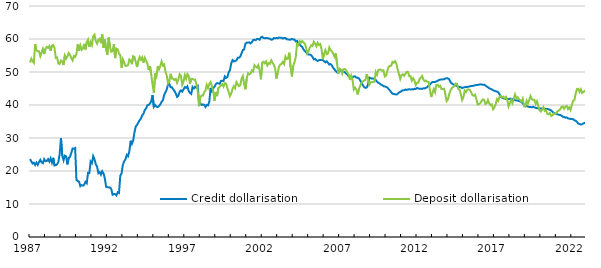
| Category | Credit dollarisation | Deposit dollarisation |
|---|---|---|
| 1987.0 | 23.625 | 52.875 |
| nan | 22.95 | 54.027 |
| nan | 22.258 | 53.298 |
| nan | 22.502 | 52.778 |
| nan | 21.814 | 58.458 |
| nan | 22.546 | 56.475 |
| nan | 21.866 | 56.292 |
| nan | 22.731 | 56.274 |
| nan | 23.362 | 54.792 |
| nan | 22.601 | 55.969 |
| nan | 22.363 | 57.052 |
| nan | 23.592 | 55.442 |
| 1988.0 | 22.977 | 57.05 |
| nan | 23.01 | 57.602 |
| nan | 23.614 | 57.327 |
| nan | 22.852 | 57.869 |
| nan | 23.86 | 56.405 |
| nan | 22.544 | 57.995 |
| nan | 23.986 | 58.181 |
| nan | 21.671 | 57.333 |
| nan | 21.772 | 54.285 |
| nan | 22.031 | 54.407 |
| nan | 22.745 | 52.546 |
| nan | 25.142 | 52.458 |
| 1989.0 | 29.909 | 53.508 |
| nan | 24.636 | 53.181 |
| nan | 23.25 | 52.127 |
| nan | 24.665 | 54.97 |
| nan | 24.465 | 54.05 |
| nan | 21.995 | 54.698 |
| nan | 24.015 | 55.753 |
| nan | 24.262 | 55.217 |
| nan | 25.462 | 54.244 |
| nan | 26.803 | 53.485 |
| nan | 26.749 | 54.857 |
| nan | 26.966 | 54.559 |
| 1990.0 | 17.318 | 55.462 |
| nan | 16.93 | 58.372 |
| nan | 16.795 | 56.471 |
| nan | 15.404 | 58.031 |
| nan | 15.742 | 56.711 |
| nan | 15.569 | 57.125 |
| nan | 15.812 | 58.503 |
| nan | 16.734 | 56.823 |
| nan | 16.287 | 58.989 |
| nan | 19.439 | 59.795 |
| nan | 19.378 | 57.582 |
| nan | 22.874 | 59.032 |
| 1991.0 | 22.371 | 58.133 |
| nan | 24.51 | 60.785 |
| nan | 23.556 | 61.282 |
| nan | 22.036 | 59.332 |
| nan | 21.344 | 58.586 |
| nan | 19.34 | 59.74 |
| nan | 19.683 | 60.063 |
| nan | 18.882 | 58.736 |
| nan | 19.931 | 61.424 |
| nan | 19.258 | 57.326 |
| nan | 17.786 | 59.85 |
| nan | 15.223 | 56.737 |
| 1992.0 | 15.105 | 55.246 |
| nan | 15.025 | 60.45 |
| nan | 14.99 | 57.648 |
| nan | 14.555 | 56.132 |
| nan | 12.8 | 56.356 |
| nan | 13.004 | 58.431 |
| nan | 13.004 | 54.208 |
| nan | 12.606 | 57.092 |
| nan | 13.556 | 56.875 |
| nan | 13.359 | 55.592 |
| nan | 18.561 | 55.136 |
| nan | 19.284 | 51.229 |
| 1993.0 | 21.895 | 53.812 |
| nan | 22.955 | 52.893 |
| nan | 23.499 | 51.839 |
| nan | 24.885 | 51.865 |
| nan | 24.446 | 52.084 |
| nan | 25.969 | 53.816 |
| nan | 29.162 | 53.497 |
| nan | 28.207 | 52.378 |
| nan | 29.243 | 54.8 |
| nan | 31.764 | 54.559 |
| nan | 33.498 | 52.968 |
| nan | 33.983 | 51.516 |
| 1994.0 | 34.715 | 53.424 |
| nan | 35.414 | 54.562 |
| nan | 35.877 | 53.697 |
| nan | 36.906 | 54.414 |
| nan | 37.356 | 52.816 |
| nan | 38.5 | 54.295 |
| nan | 38.976 | 53.401 |
| nan | 39.917 | 52.561 |
| nan | 40.022 | 50.595 |
| nan | 40.473 | 51.76 |
| nan | 41.216 | 49.124 |
| nan | 42.967 | 46.2 |
| 1995.0 | 39.44 | 43.739 |
| nan | 39.979 | 49.526 |
| nan | 39.488 | 48.642 |
| nan | 39.395 | 51.711 |
| nan | 39.683 | 50.774 |
| nan | 40.19 | 51.754 |
| nan | 40.966 | 53.206 |
| nan | 41.39 | 51.96 |
| nan | 43.048 | 52.299 |
| nan | 43.809 | 50.104 |
| nan | 44.691 | 48.953 |
| nan | 46.247 | 46.537 |
| 1996.0 | 46.378 | 47.151 |
| nan | 45.387 | 49.437 |
| nan | 45.395 | 48.044 |
| nan | 44.735 | 47.922 |
| nan | 44.227 | 47.56 |
| nan | 43.505 | 47.902 |
| nan | 42.463 | 46.732 |
| nan | 42.779 | 47.697 |
| nan | 44.012 | 49.309 |
| nan | 44.443 | 48.844 |
| nan | 44.066 | 46.107 |
| nan | 44.721 | 47.042 |
| 1997.0 | 45.425 | 49.058 |
| nan | 45.179 | 47.945 |
| nan | 45.65 | 49.402 |
| nan | 44.224 | 48.837 |
| nan | 43.681 | 46.409 |
| nan | 43.354 | 47.921 |
| nan | 45.462 | 47.903 |
| nan | 45.016 | 47.664 |
| nan | 45.517 | 47.695 |
| nan | 45.22 | 46.255 |
| nan | 45.715 | 44.241 |
| nan | 40.88 | 39.634 |
| 1998.0 | 40.505 | 42.31 |
| nan | 40.015 | 42.858 |
| nan | 40.178 | 42.842 |
| nan | 40.057 | 43.859 |
| nan | 39.39 | 44.331 |
| nan | 40.04 | 46.132 |
| nan | 39.898 | 45.151 |
| nan | 40.994 | 46.371 |
| nan | 45.185 | 46.973 |
| nan | 44.179 | 45.746 |
| nan | 45.005 | 44.31 |
| nan | 45.551 | 41.249 |
| 1999.0 | 46.308 | 43.958 |
| nan | 46.621 | 42.703 |
| nan | 46.577 | 45.113 |
| nan | 46.426 | 45.508 |
| nan | 47.288 | 45.918 |
| nan | 47.359 | 46.346 |
| nan | 47.219 | 45.571 |
| nan | 48.656 | 46.582 |
| nan | 48.196 | 46.453 |
| nan | 48.46 | 45.118 |
| nan | 49.897 | 43.975 |
| nan | 50.552 | 42.672 |
| 2000.0 | 52.621 | 43.463 |
| nan | 53.603 | 44.848 |
| nan | 53.183 | 45.691 |
| nan | 53.358 | 45.08 |
| nan | 53.51 | 46.924 |
| nan | 54.317 | 46.257 |
| nan | 54.344 | 45.72 |
| nan | 54.65 | 45.98 |
| nan | 55.662 | 47.959 |
| nan | 56.669 | 48.758 |
| nan | 56.84 | 46.333 |
| nan | 58.59 | 44.771 |
| 2001.0 | 58.915 | 48.081 |
| nan | 58.891 | 49.62 |
| nan | 58.993 | 49.291 |
| nan | 58.649 | 49.587 |
| nan | 59.025 | 50.497 |
| nan | 59.701 | 50.162 |
| nan | 59.76 | 52.075 |
| nan | 59.659 | 51.654 |
| nan | 60.009 | 51.343 |
| nan | 60.005 | 52.071 |
| nan | 59.775 | 50.502 |
| nan | 60.481 | 47.812 |
| 2002.0 | 60.685 | 52.829 |
| nan | 60.291 | 53.086 |
| nan | 60.249 | 52.637 |
| nan | 60.274 | 53.207 |
| nan | 60.282 | 51.99 |
| nan | 60.129 | 52.704 |
| nan | 60.105 | 52.478 |
| nan | 59.788 | 53.54 |
| nan | 59.858 | 52.81 |
| nan | 60.288 | 52.151 |
| nan | 60.197 | 51.193 |
| nan | 60.319 | 48.029 |
| 2003.0 | 60.212 | 49.682 |
| nan | 60.455 | 51.567 |
| nan | 60.379 | 52.293 |
| nan | 60.361 | 52.464 |
| nan | 60.143 | 53.108 |
| nan | 60.334 | 52.434 |
| nan | 60.309 | 54.663 |
| nan | 59.899 | 53.915 |
| nan | 59.881 | 54.066 |
| nan | 59.824 | 55.859 |
| nan | 59.771 | 51.368 |
| nan | 60.027 | 48.63 |
| 2004.0 | 59.864 | 51.833 |
| nan | 59.84 | 52.936 |
| nan | 59.288 | 54.524 |
| nan | 59.431 | 58.5 |
| nan | 58.733 | 58.116 |
| nan | 58.34 | 59.352 |
| nan | 57.903 | 58.862 |
| nan | 57.635 | 59.379 |
| nan | 56.856 | 58.952 |
| nan | 56.375 | 58.615 |
| nan | 55.961 | 57.404 |
| nan | 55.521 | 55.613 |
| 2005.0 | 55.28 | 56.515 |
| nan | 55.264 | 57.372 |
| nan | 55.064 | 58.115 |
| nan | 54.564 | 57.889 |
| nan | 53.832 | 59.168 |
| nan | 53.977 | 58.599 |
| nan | 53.564 | 57.817 |
| nan | 53.346 | 58.866 |
| nan | 53.594 | 58.188 |
| nan | 53.61 | 58.454 |
| nan | 53.648 | 56.849 |
| nan | 53.635 | 53.859 |
| 2006.0 | 53.247 | 55.618 |
| nan | 52.908 | 56.639 |
| nan | 53.268 | 55.378 |
| nan | 52.779 | 55.617 |
| nan | 52.263 | 57.442 |
| nan | 52.405 | 56.606 |
| nan | 51.999 | 56.246 |
| nan | 51.234 | 55.616 |
| nan | 50.811 | 54.651 |
| nan | 50.283 | 55.611 |
| nan | 49.902 | 52.633 |
| nan | 50.296 | 49.478 |
| 2007.0 | 50.55 | 51.023 |
| nan | 50.257 | 50.75 |
| nan | 50.426 | 49.525 |
| nan | 50.134 | 50.832 |
| nan | 49.903 | 50.91 |
| nan | 49.508 | 50.587 |
| nan | 49.304 | 49.756 |
| nan | 48.658 | 49.255 |
| nan | 48.604 | 47.604 |
| nan | 48.691 | 48.908 |
| nan | 48.365 | 47.636 |
| nan | 48.606 | 44.695 |
| 2008.0 | 48.7 | 45.241 |
| nan | 48.314 | 44.684 |
| nan | 48.234 | 43.211 |
| nan | 48.061 | 44.829 |
| nan | 47.425 | 45.89 |
| nan | 46.676 | 46.735 |
| nan | 46.027 | 47.124 |
| nan | 45.442 | 47.432 |
| nan | 45.192 | 47.544 |
| nan | 45.306 | 49.329 |
| nan | 46.165 | 48.037 |
| nan | 48.3 | 46.173 |
| 2009.0 | 48.1 | 46.911 |
| nan | 48.009 | 46.868 |
| nan | 48.031 | 47.032 |
| nan | 47.873 | 47.042 |
| nan | 47.586 | 50.014 |
| nan | 47.087 | 49.169 |
| nan | 46.749 | 50.61 |
| nan | 46.535 | 50.731 |
| nan | 46.187 | 50.681 |
| nan | 46.036 | 50.384 |
| nan | 45.691 | 50.487 |
| nan | 45.632 | 48.639 |
| 2010.0 | 45.465 | 48.905 |
| nan | 45.306 | 50.338 |
| nan | 44.819 | 51.557 |
| nan | 44.406 | 51.861 |
| nan | 43.885 | 51.881 |
| nan | 43.412 | 53.079 |
| nan | 43.347 | 52.816 |
| nan | 43.238 | 53.265 |
| nan | 43.18 | 52.491 |
| nan | 43.362 | 50.794 |
| nan | 43.778 | 49.316 |
| nan | 43.976 | 47.902 |
| 2011.0 | 44.241 | 49.049 |
| nan | 44.477 | 49.304 |
| nan | 44.471 | 48.832 |
| nan | 44.692 | 49.432 |
| nan | 44.578 | 50.08 |
| nan | 44.707 | 50.027 |
| nan | 44.784 | 48.698 |
| nan | 44.67 | 48.69 |
| nan | 44.762 | 47.382 |
| nan | 44.727 | 48.127 |
| nan | 44.916 | 47.414 |
| nan | 44.831 | 46.08 |
| 2012.0 | 45.174 | 46.764 |
| nan | 45.001 | 46.737 |
| nan | 44.902 | 47.904 |
| nan | 44.962 | 48.272 |
| nan | 44.873 | 48.804 |
| nan | 45.05 | 47.623 |
| nan | 45.032 | 47.241 |
| nan | 45.219 | 47.399 |
| nan | 45.398 | 47.011 |
| nan | 45.956 | 46.971 |
| nan | 46.191 | 44.615 |
| nan | 46.667 | 42.416 |
| 2013.0 | 46.979 | 43.698 |
| nan | 46.957 | 44.83 |
| nan | 46.978 | 43.857 |
| nan | 47.14 | 46.061 |
| nan | 47.325 | 46.14 |
| nan | 47.568 | 45.515 |
| nan | 47.691 | 45.794 |
| nan | 47.736 | 44.819 |
| nan | 47.765 | 44.86 |
| nan | 47.786 | 44.937 |
| nan | 48.024 | 43.182 |
| nan | 48.124 | 41.191 |
| 2014.0 | 48.059 | 41.698 |
| nan | 47.754 | 43.351 |
| nan | 46.928 | 44.402 |
| nan | 46.534 | 45.131 |
| nan | 46.274 | 45.45 |
| nan | 46.051 | 45.697 |
| nan | 45.95 | 46.503 |
| nan | 45.7 | 46.374 |
| nan | 45.568 | 44.823 |
| nan | 45.426 | 44.641 |
| nan | 45.359 | 43.206 |
| nan | 45.141 | 41.502 |
| 2015.0 | 45.327 | 42.429 |
| nan | 45.359 | 44.333 |
| nan | 45.508 | 43.914 |
| nan | 45.438 | 44.7 |
| nan | 45.575 | 44.702 |
| nan | 45.654 | 44.561 |
| nan | 45.749 | 43.812 |
| nan | 45.785 | 42.965 |
| nan | 45.846 | 42.818 |
| nan | 46.006 | 43.139 |
| nan | 46.031 | 41.861 |
| nan | 46.079 | 40.145 |
| 2016.0 | 46.159 | 40.271 |
| nan | 46.265 | 40.512 |
| nan | 46.223 | 41.198 |
| nan | 46.102 | 41.717 |
| nan | 46.178 | 41.569 |
| nan | 45.902 | 40.31 |
| nan | 45.616 | 40.538 |
| nan | 45.377 | 41.518 |
| nan | 45.05 | 40.463 |
| nan | 44.92 | 39.915 |
| nan | 44.703 | 40.167 |
| nan | 44.479 | 38.724 |
| 2017.0 | 44.304 | 39.248 |
| nan | 44.176 | 40.321 |
| nan | 44.069 | 41.785 |
| nan | 43.855 | 41.276 |
| nan | 43.237 | 42.579 |
| nan | 42.487 | 42.736 |
| nan | 42.22 | 42.287 |
| nan | 42.068 | 42.529 |
| nan | 41.895 | 41.972 |
| nan | 41.79 | 42.458 |
| nan | 41.785 | 41.476 |
| nan | 41.794 | 39.558 |
| 2018.0 | 41.901 | 40.518 |
| nan | 41.839 | 41.598 |
| nan | 41.715 | 40.555 |
| nan | 41.565 | 41.833 |
| nan | 41.478 | 43.196 |
| nan | 41.397 | 42.118 |
| nan | 41.359 | 42.368 |
| nan | 41.21 | 41.803 |
| nan | 41.058 | 41.467 |
| nan | 40.886 | 41.014 |
| nan | 40.456 | 41.913 |
| nan | 40.117 | 39.614 |
| 2019.0 | 39.925 | 39.47 |
| nan | 39.695 | 41.317 |
| nan | 39.513 | 40.442 |
| nan | 39.402 | 41.52 |
| nan | 39.387 | 42.742 |
| nan | 39.298 | 41.79 |
| nan | 39.478 | 41.527 |
| nan | 39.269 | 41.604 |
| nan | 39.133 | 40.3 |
| nan | 39.036 | 41.113 |
| nan | 38.996 | 39.787 |
| nan | 38.912 | 38.349 |
| 2020.0 | 38.968 | 38.012 |
| nan | 38.896 | 38.582 |
| nan | 38.951 | 39.324 |
| nan | 38.844 | 38.208 |
| nan | 38.811 | 38.488 |
| nan | 38.785 | 37.286 |
| nan | 38.719 | 37.234 |
| nan | 38.555 | 37.578 |
| nan | 38.359 | 36.666 |
| nan | 37.98 | 36.863 |
| nan | 37.597 | 37.462 |
| nan | 37.437 | 37.351 |
| 2021.0 | 37.326 | 37.572 |
| nan | 37.162 | 38.121 |
| nan | 37.015 | 38.321 |
| nan | 36.986 | 38.662 |
| nan | 36.788 | 39.459 |
| nan | 36.45 | 39.562 |
| nan | 36.38 | 38.855 |
| nan | 36.176 | 39.502 |
| nan | 36.247 | 39.708 |
| nan | 35.956 | 38.799 |
| nan | 35.884 | 39.267 |
| nan | 35.784 | 38.484 |
| 2022.0 | 35.772 | 40 |
| nan | 35.72 | 41.24 |
| nan | 35.341 | 41.512 |
| nan | 35.257 | 43.455 |
| nan | 34.87 | 44.832 |
| nan | 34.374 | 44.913 |
| nan | 34.243 | 43.981 |
| nan | 34.091 | 44.763 |
| nan | 34.166 | 43.651 |
| nan | 34.442 | 44.019 |
| nan | 34.548 | 44.272 |
| nan | 34.824 | 43.903 |